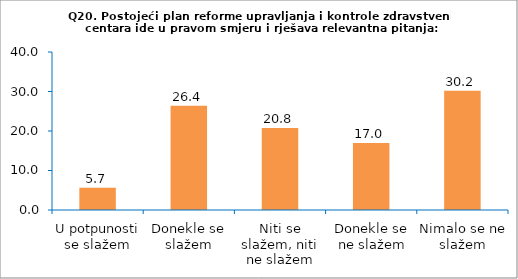
| Category | Series 0 |
|---|---|
| U potpunosti se slažem | 5.66 |
| Donekle se slažem | 26.415 |
| Niti se slažem, niti ne slažem | 20.755 |
| Donekle se ne slažem | 16.981 |
| Nimalo se ne slažem | 30.189 |